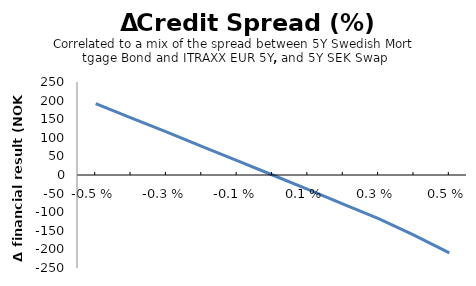
| Category | Series 0 |
|---|---|
| -0.005 | 191.835 |
| -0.004 | 153.284 |
| -0.003 | 115.652 |
| -0.002 | 77.101 |
| -0.001 | 38.551 |
| 0.0 | 0 |
| 0.001 | -38.551 |
| 0.002 | -78.019 |
| 0.003 | -117.487 |
| 0.004 | -161.545 |
| 0.005 | -209.275 |